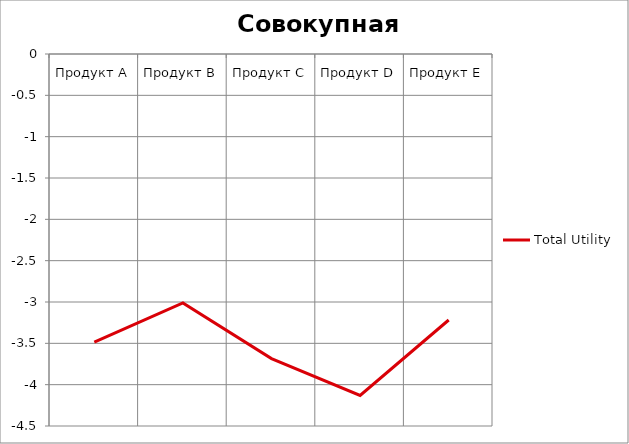
| Category | Total Utility |
|---|---|
| Продукт А | -3.487 |
| Продукт В | -3.011 |
| Продукт С | -3.685 |
| Продукт D | -4.131 |
| Продукт Е | -3.218 |